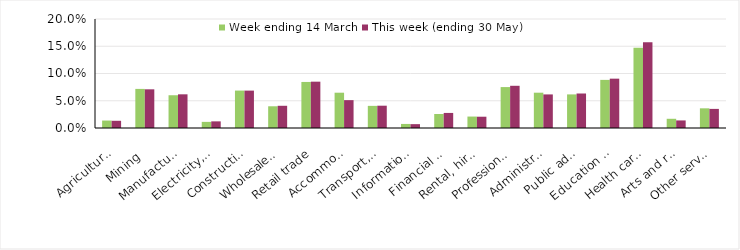
| Category | Week ending 14 March | This week (ending 30 May) |
|---|---|---|
| Agriculture, forestry and fishing | 0.014 | 0.013 |
| Mining | 0.072 | 0.071 |
| Manufacturing | 0.06 | 0.062 |
| Electricity, gas, water and waste services | 0.011 | 0.012 |
| Construction | 0.069 | 0.069 |
| Wholesale trade | 0.04 | 0.041 |
| Retail trade | 0.084 | 0.085 |
| Accommodation and food services | 0.065 | 0.051 |
| Transport, postal and warehousing | 0.041 | 0.041 |
| Information media and telecommunications | 0.007 | 0.007 |
| Financial and insurance services | 0.026 | 0.028 |
| Rental, hiring and real estate services | 0.021 | 0.021 |
| Professional, scientific and technical services | 0.075 | 0.077 |
| Administrative and support services | 0.065 | 0.062 |
| Public administration and safety | 0.062 | 0.063 |
| Education and training | 0.088 | 0.091 |
| Health care and social assistance | 0.147 | 0.157 |
| Arts and recreation services | 0.017 | 0.014 |
| Other services | 0.036 | 0.035 |